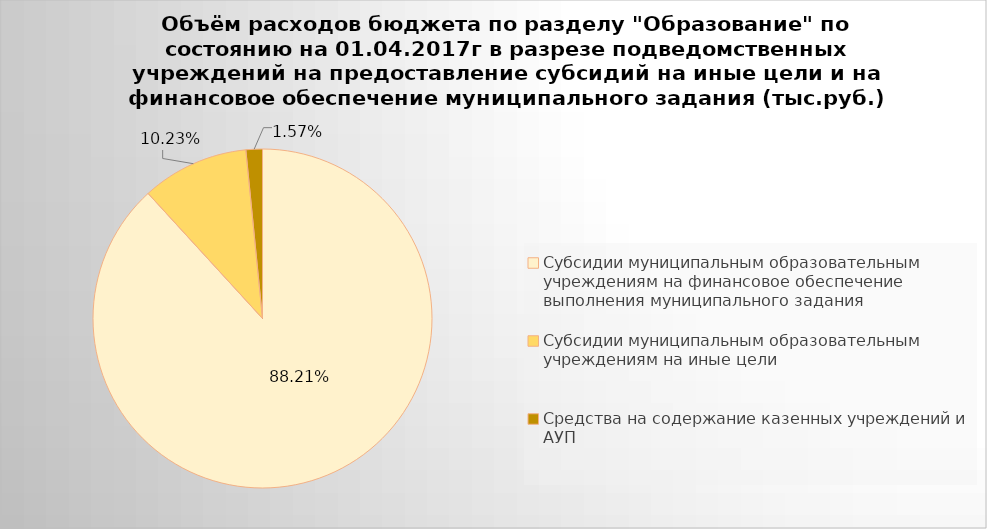
| Category | Series 0 |
|---|---|
| Субсидии муниципальным образовательным учреждениям на финансовое обеспечение выполнения муниципального задания | 4562334.14 |
| Субсидии муниципальным образовательным учреждениям на иные цели | 528935.62 |
| Средства на содержание казенных учреждений и АУП | 81117.55 |